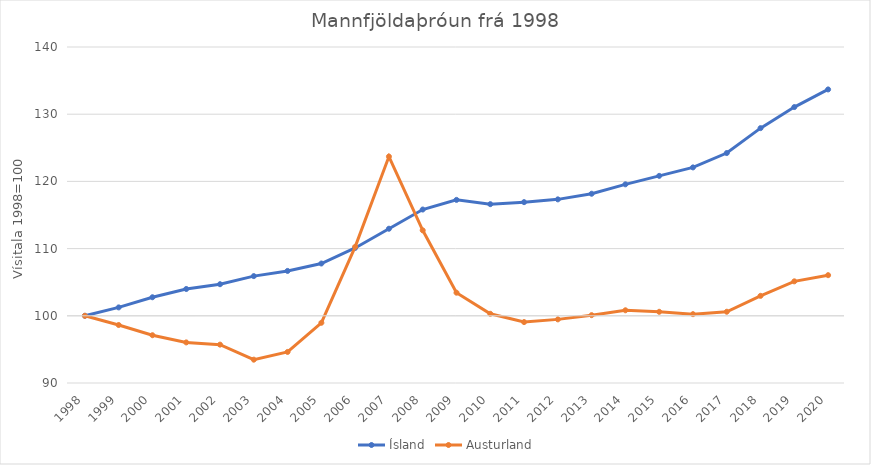
| Category | Ísland | Austurland |
|---|---|---|
| 1998.0 | 100 | 100 |
| 1999.0 | 101.25 | 98.63 |
| 2000.0 | 102.76 | 97.11 |
| 2001.0 | 103.99 | 96.04 |
| 2002.0 | 104.7 | 95.71 |
| 2003.0 | 105.907 | 93.471 |
| 2004.0 | 106.678 | 94.622 |
| 2005.0 | 107.782 | 98.962 |
| 2006.0 | 110.1 | 110.264 |
| 2007.0 | 112.956 | 123.7 |
| 2008.0 | 115.815 | 112.719 |
| 2009.0 | 117.25 | 103.437 |
| 2010.0 | 116.612 | 100.298 |
| 2011.0 | 116.914 | 99.066 |
| 2012.0 | 117.326 | 99.469 |
| 2013.0 | 118.164 | 100.097 |
| 2014.0 | 119.565 | 100.821 |
| 2015.0 | 120.823 | 100.596 |
| 2016.0 | 122.082 | 100.242 |
| 2017.0 | 124.219 | 100.604 |
| 2018.0 | 127.927 | 102.971 |
| 2019.0 | 131.063 | 105.128 |
| 2020.0 | 133.686 | 106.046 |